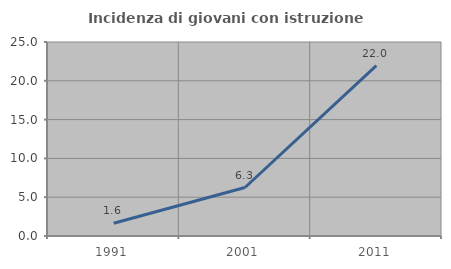
| Category | Incidenza di giovani con istruzione universitaria |
|---|---|
| 1991.0 | 1.639 |
| 2001.0 | 6.25 |
| 2011.0 | 21.951 |